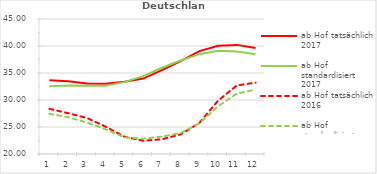
| Category | ab Hof tatsächlich 2017 | ab Hof standardisiert 2017 | ab Hof tatsächlich 2016 | ab Hof standardisiert 2016 |
|---|---|---|---|---|
| 0 | 33.651 | 32.53 | 28.366 | 27.446 |
| 1 | 33.49 | 32.677 | 27.554 | 26.822 |
| 2 | 33.057 | 32.631 | 26.679 | 25.829 |
| 3 | 32.998 | 32.659 | 25.052 | 24.585 |
| 4 | 33.367 | 33.307 | 23.213 | 23.081 |
| 5 | 33.965 | 34.421 | 22.459 | 22.829 |
| 6 | 35.544 | 35.976 | 22.729 | 23.22 |
| 7 | 37.18 | 37.319 | 23.641 | 23.882 |
| 8 | 39.046 | 38.486 | 25.754 | 25.703 |
| 9 | 40.041 | 39.136 | 29.896 | 28.837 |
| 10 | 40.206 | 38.985 | 32.701 | 31.195 |
| 11 | 39.632 | 38.462 | 33.211 | 31.941 |